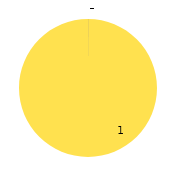
| Category | Sunday | Department |
|---|---|---|
| 0 | 0 | 0 |
| 1 | 0 | 0 |
| 2 | 0 | 0 |
| 3 | 0 | 0 |
| 4 | 1 | 0 |
| 5 | 0 | 0 |
| 6 | 0 | 0 |
| 7 | 0 | 0 |
| 8 | 0 | 0 |
| 9 | 0 | 0 |
| 10 | 0 | 0 |
| 11 | 0 | 0 |
| 12 | 0 | 0 |
| 13 | 0 | 0 |
| 14 | 0 | 0 |
| 15 | 0 | 0 |
| 16 | 0 | 0 |
| 17 | 0 | 0 |
| 18 | 0 | 0 |
| 19 | 0 | 0 |